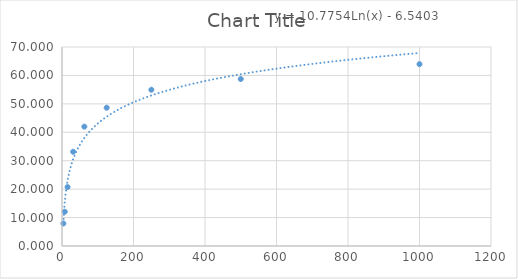
| Category | Series 0 |
|---|---|
| 3.91 | 7.928 |
| 7.81 | 12.072 |
| 15.62 | 20.721 |
| 31.25 | 33.153 |
| 62.5 | 41.982 |
| 125.0 | 48.649 |
| 250.0 | 54.955 |
| 500.0 | 58.739 |
| 1000.0 | 63.964 |